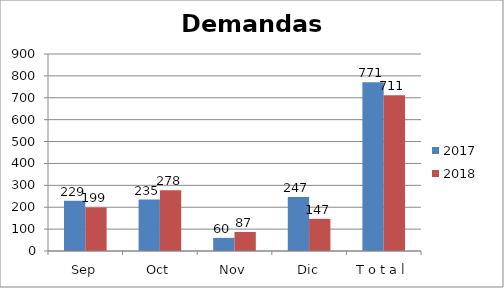
| Category | 2017 | 2018 |
|---|---|---|
| Sep | 229 | 199 |
| Oct | 235 | 278 |
| Nov | 60 | 87 |
| Dic | 247 | 147 |
| T o t a l | 771 | 711 |